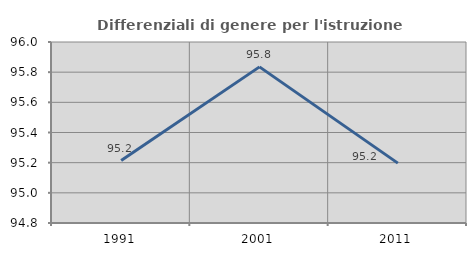
| Category | Differenziali di genere per l'istruzione superiore |
|---|---|
| 1991.0 | 95.214 |
| 2001.0 | 95.835 |
| 2011.0 | 95.197 |